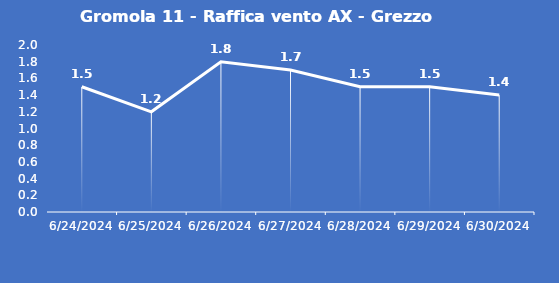
| Category | Gromola 11 - Raffica vento AX - Grezzo (m/s) |
|---|---|
| 6/24/24 | 1.5 |
| 6/25/24 | 1.2 |
| 6/26/24 | 1.8 |
| 6/27/24 | 1.7 |
| 6/28/24 | 1.5 |
| 6/29/24 | 1.5 |
| 6/30/24 | 1.4 |